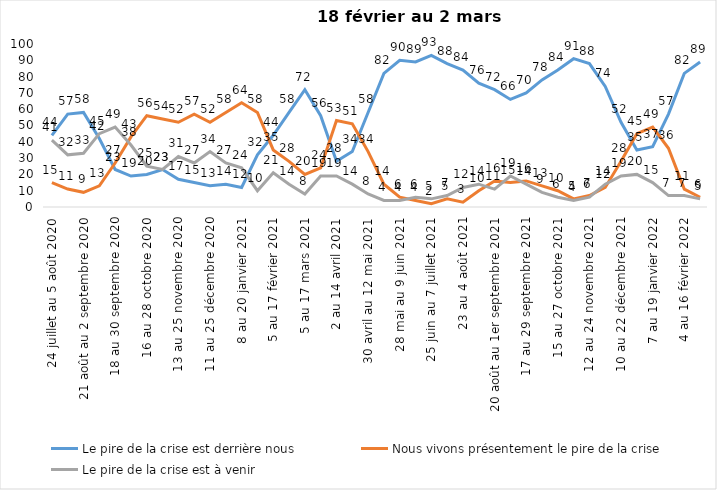
| Category | Le pire de la crise est derrière nous | Nous vivons présentement le pire de la crise | Le pire de la crise est à venir |
|---|---|---|---|
| 24 juillet au 5 août 2020 | 44 | 15 | 41 |
| 7 au 19 août 2020 | 57 | 11 | 32 |
| 21 août au 2 septembre 2020 | 58 | 9 | 33 |
| 4 au 16 septembre 2020 | 42 | 13 | 45 |
| 18 au 30 septembre 2020 | 23 | 27 | 49 |
| 2 au 14 octobre 2020 | 19 | 43 | 38 |
| 16 au 28 octobre 2020 | 20 | 56 | 25 |
| 30 octobre au 11 novembre 2020 | 23 | 54 | 23 |
| 13 au 25 novembre 2020 | 17 | 52 | 31 |
| 27 au 9 décembre 2020 | 15 | 57 | 27 |
| 11 au 25 décembre 2020 | 13 | 52 | 34 |
| 25 décembre 2020 au 6 janvier 2021 | 14 | 58 | 27 |
| 8 au 20 janvier 2021 | 12 | 64 | 24 |
| 22 janvier au 3 février 2021 | 32 | 58 | 10 |
| 5 au 17 février 2021 | 44 | 35 | 21 |
| 19 février au 3 mars 2021 | 58 | 28 | 14 |
| 5 au 17 mars 2021 | 72 | 20 | 8 |
| 19 au 31 mars 2021 | 56 | 24 | 19 |
| 2 au 14 avril 2021 | 28 | 53 | 19 |
| 16 au 28 avril 2021 | 34 | 51 | 14 |
| 30 avril au 12 mai 2021 | 58 | 34 | 8 |
| 14 au 26 mai 2021 | 82 | 14 | 4 |
| 28 mai au 9 juin 2021 | 90 | 6 | 4 |
| 11 au 23 juin 2021 | 89 | 4 | 6 |
| 25 juin au 7 juillet 2021 | 93 | 2 | 5 |
| 9 au 21 juillet 2021 | 88 | 5 | 7 |
| 23 au 4 août 2021 | 84 | 3 | 12 |
| 6 au 18 août 2021 | 76 | 10 | 14 |
| 20 août au 1er septembre 2021 | 72 | 16 | 11 |
| 3 au 15 septembre 2021 | 66 | 15 | 19 |
| 17 au 29 septembre 2021 | 70 | 16 | 14 |
| 1 au 13 octobre 2021 | 78 | 13 | 9 |
| 15 au 27 octobre 2021 | 84 | 10 | 6 |
| 29 octobre au 10 novembre 2021 | 91 | 5 | 4 |
| 12 au 24 novembre 2021 | 88 | 7 | 6 |
| 26 novembre au 8 décembre 2021 | 74 | 12 | 14 |
| 10 au 22 décembre 2021 | 52 | 28 | 19 |
| 24 décembre 2021 au 5 janvier 2022 2022 | 35 | 45 | 20 |
| 7 au 19 janvier 2022 | 37 | 49 | 15 |
| 21 janvier au 2 février 2022 | 57 | 36 | 7 |
| 4 au 16 février 2022 | 82 | 11 | 7 |
| 18 février au 2 mars  2022 | 89 | 6 | 5 |